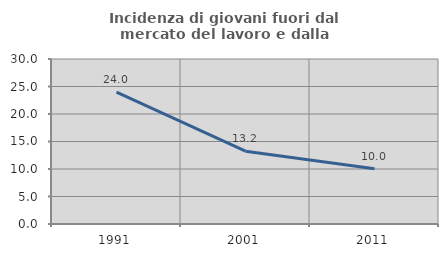
| Category | Incidenza di giovani fuori dal mercato del lavoro e dalla formazione  |
|---|---|
| 1991.0 | 23.969 |
| 2001.0 | 13.231 |
| 2011.0 | 10.036 |